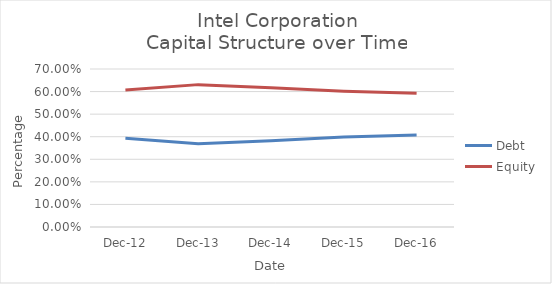
| Category | Debt | Equity |
|---|---|---|
| 2016-12-31 | 0.408 | 0.592 |
| 2015-12-31 | 0.399 | 0.601 |
| 2014-12-31 | 0.383 | 0.617 |
| 2013-12-31 | 0.369 | 0.631 |
| 2012-12-31 | 0.393 | 0.607 |